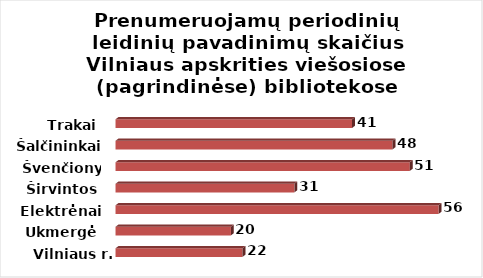
| Category | Series 0 |
|---|---|
| Vilniaus r. | 22 |
| Ukmergė | 20 |
| Elektrėnai | 56 |
| Širvintos | 31 |
| Švenčionys | 51 |
| Šalčininkai | 48 |
| Trakai | 41 |